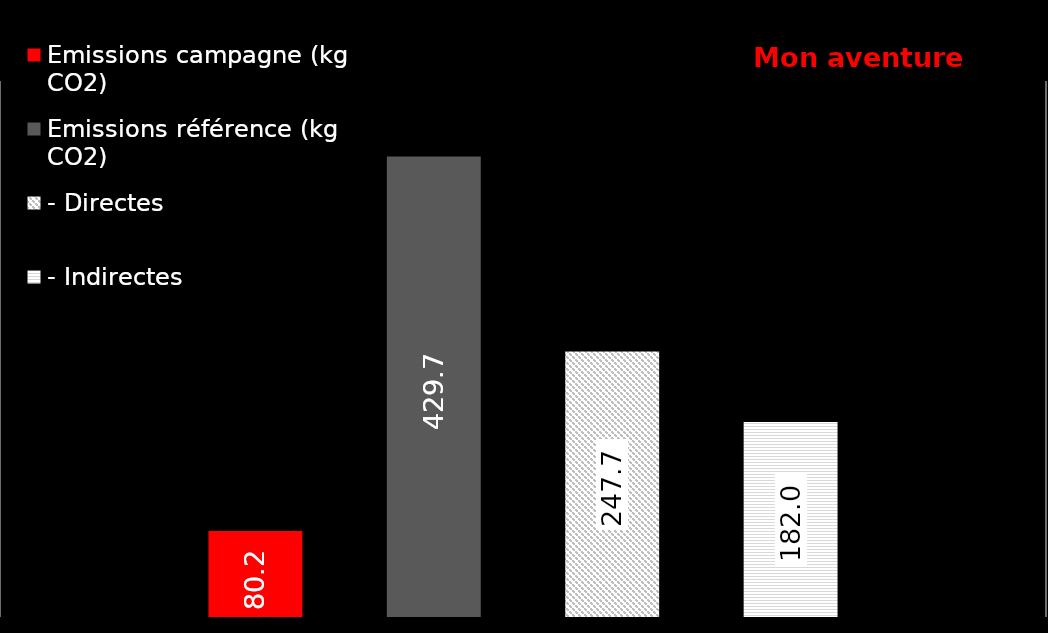
| Category | Emissions campagne (kg CO2) | Emissions référence (kg CO2) | - Directes | - Indirectes |
|---|---|---|---|---|
| 0 | 80.191 | 429.682 | 247.675 | 182.007 |